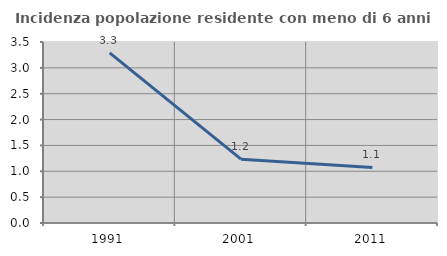
| Category | Incidenza popolazione residente con meno di 6 anni |
|---|---|
| 1991.0 | 3.289 |
| 2001.0 | 1.235 |
| 2011.0 | 1.075 |